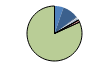
| Category | Series 0 |
|---|---|
| ARRASTRE | 12 |
| CERCO | 21 |
| ATUNEROS CAÑEROS | 1 |
| PALANGRE DE FONDO | 1 |
| PALANGRE DE SUPERFICIE | 3 |
| RASCO | 0 |
| VOLANTA | 0 |
| ARTES FIJAS | 3 |
| ARTES MENORES | 184 |